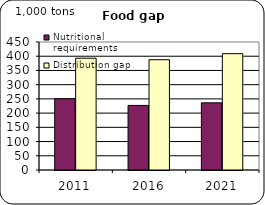
| Category | Nutritional requirements | Distribution gap |
|---|---|---|
| 2011.0 | 250.487 | 393.011 |
| 2016.0 | 227.029 | 387.662 |
| 2021.0 | 236.105 | 408.952 |